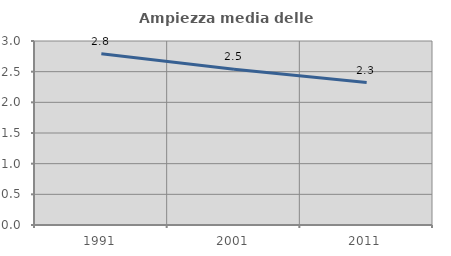
| Category | Ampiezza media delle famiglie |
|---|---|
| 1991.0 | 2.791 |
| 2001.0 | 2.538 |
| 2011.0 | 2.323 |